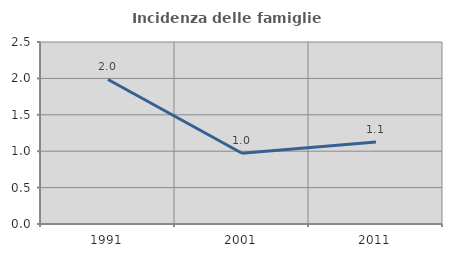
| Category | Incidenza delle famiglie numerose |
|---|---|
| 1991.0 | 1.985 |
| 2001.0 | 0.972 |
| 2011.0 | 1.125 |